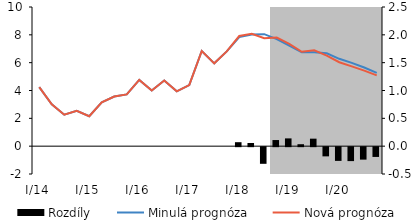
| Category | Rozdíly |
|---|---|
| I/14 | 0 |
| II | 0 |
| III | 0 |
| IV | 0 |
| I/15 | 0 |
| II | 0 |
| III | 0 |
| IV | 0 |
| I/16 | 0 |
| II | 0 |
| III | 0 |
| IV | 0 |
| I/17 | 0 |
| II | 0 |
| III | 0 |
| IV | 0 |
| I/18 | 0.071 |
| II | 0.057 |
| III | -0.299 |
| IV | 0.11 |
| I/19 | 0.14 |
| II | 0.035 |
| III | 0.135 |
| IV | -0.165 |
| I/20 | -0.247 |
| II | -0.25 |
| III | -0.224 |
| IV | -0.176 |